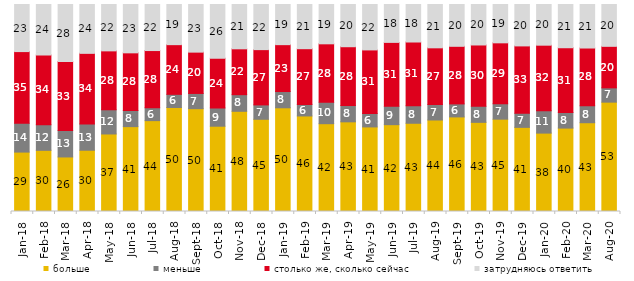
| Category | больше | меньше | столько же, сколько сейчас | затрудняюсь ответить |
|---|---|---|---|---|
| 2018-01-01 | 28.7 | 13.9 | 34.65 | 22.75 |
| 2018-02-01 | 29.55 | 12.4 | 33.7 | 24.35 |
| 2018-03-01 | 26.35 | 12.75 | 33.35 | 27.55 |
| 2018-04-01 | 29.6 | 12.7 | 34.1 | 23.6 |
| 2018-05-01 | 37.45 | 11.7 | 28.45 | 22.4 |
| 2018-06-01 | 41 | 7.8 | 27.85 | 23.35 |
| 2018-07-01 | 43.9 | 6.25 | 27.6 | 22.25 |
| 2018-08-01 | 50.25 | 6.35 | 24 | 19.4 |
| 2018-09-01 | 49.65 | 7.35 | 19.95 | 23 |
| 2018-10-01 | 41.2 | 8.85 | 23.95 | 26 |
| 2018-11-01 | 48.403 | 8.034 | 22.156 | 21.407 |
| 2018-12-01 | 44.55 | 6.95 | 26.7 | 21.8 |
| 2019-01-01 | 50.1 | 7.85 | 22.65 | 19.4 |
| 2019-02-01 | 46.15 | 5.6 | 26.9 | 21.35 |
| 2019-03-01 | 42.417 | 10.343 | 28.245 | 18.996 |
| 2019-04-01 | 43.317 | 7.871 | 28.416 | 20.396 |
| 2019-05-01 | 40.862 | 6.439 | 30.758 | 21.942 |
| 2019-06-01 | 41.945 | 8.878 | 30.873 | 18.304 |
| 2019-07-01 | 42.624 | 8.465 | 30.792 | 18.119 |
| 2019-08-01 | 44.206 | 7.493 | 27.373 | 20.929 |
| 2019-09-01 | 45.693 | 6.287 | 27.822 | 20.198 |
| 2019-10-01 | 43.069 | 7.723 | 29.653 | 19.554 |
| 2019-11-01 | 44.604 | 7.426 | 29.455 | 18.515 |
| 2019-12-01 | 40.644 | 6.782 | 32.574 | 20 |
| 2020-01-01 | 37.871 | 10.842 | 31.634 | 19.653 |
| 2020-02-01 | 40.297 | 7.525 | 31.287 | 20.891 |
| 2020-03-01 | 42.885 | 8.18 | 27.913 | 21.021 |
| 2020-08-01 | 52.83 | 6.902 | 20.06 | 20.209 |